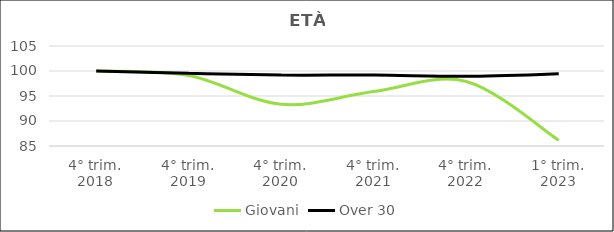
| Category | Giovani | Over 30 |
|---|---|---|
| 4° trim.
2018 | 100 | 100 |
| 4° trim.
2019 | 99.108 | 99.542 |
| 4° trim.
2020 | 93.345 | 99.191 |
| 4° trim.
2021 | 95.883 | 99.185 |
| 4° trim.
2022 | 97.907 | 98.929 |
| 1° trim.
2023 | 86.141 | 99.43 |